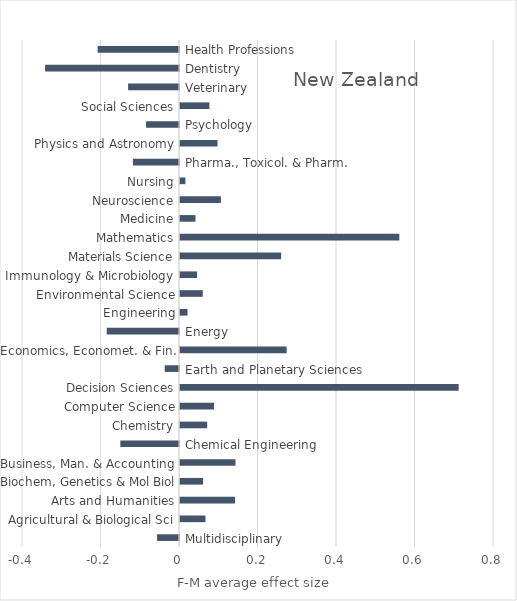
| Category | F-M average effect size | Proportion of years |
|---|---|---|
|  | -0.056 | 0 |
|  | 0.065 | 0 |
|  | 0.14 | 0 |
|  | 0.059 | 0 |
|  | 0.141 | 0 |
|  | -0.149 | 0 |
|  | 0.069 | 0 |
|  | 0.087 | 0 |
|  | 0.71 | 0 |
|  | -0.036 | 0 |
|  | 0.272 | 0 |
|  | -0.184 | 0 |
|  | 0.019 | 0 |
|  | 0.058 | 0 |
|  | 0.043 | 0 |
|  | 0.258 | 0 |
|  | 0.559 | 0 |
|  | 0.039 | 0 |
|  | 0.104 | 0 |
|  | 0.014 | 0 |
|  | -0.117 | 0 |
|  | 0.096 | 0 |
|  | -0.084 | 0 |
|  | 0.075 | 0 |
|  | -0.13 | 0 |
|  | -0.341 | 0 |
|  | -0.207 | 0 |